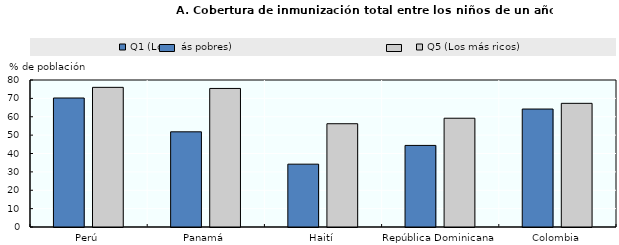
| Category | Q1 (Los más pobres) | Q5 (Los más ricos) |
|---|---|---|
| Perú | 70.2 | 76 |
| Panamá | 51.8 | 75.4 |
| Haití | 34.2 | 56.2 |
| República Dominicana | 44.4 | 59.2 |
| Colombia | 64.2 | 67.3 |